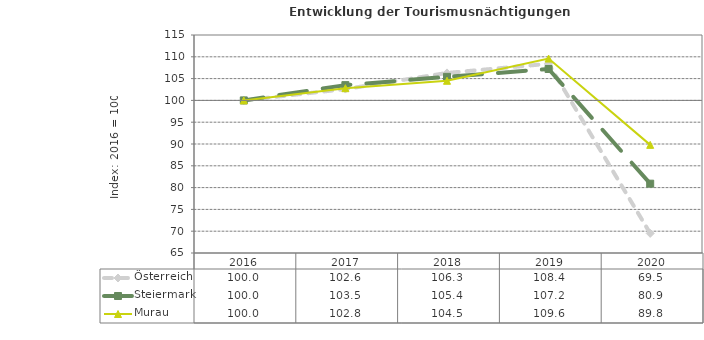
| Category | Österreich | Steiermark | Murau |
|---|---|---|---|
| 2020.0 | 69.5 | 80.9 | 89.8 |
| 2019.0 | 108.4 | 107.2 | 109.6 |
| 2018.0 | 106.3 | 105.4 | 104.5 |
| 2017.0 | 102.6 | 103.5 | 102.8 |
| 2016.0 | 100 | 100 | 100 |